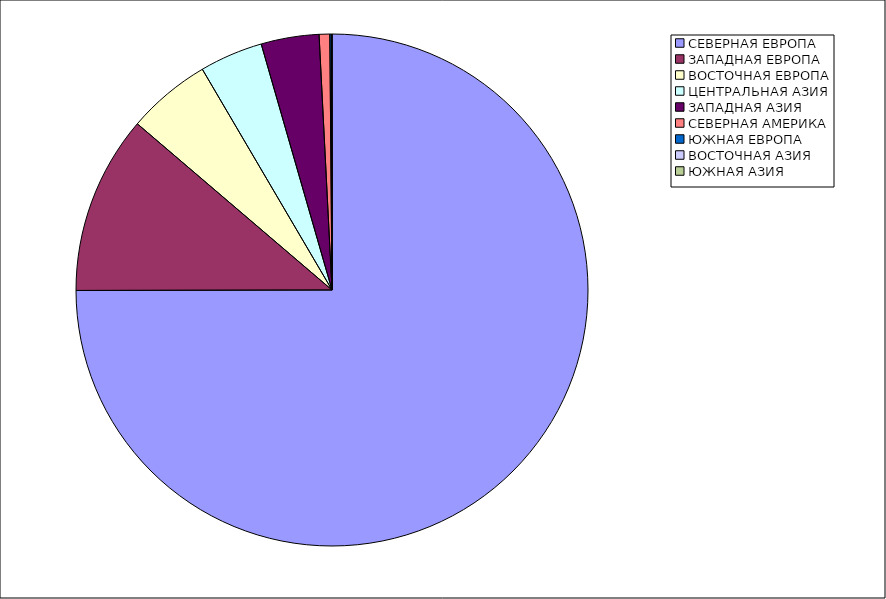
| Category | Оборот |
|---|---|
| СЕВЕРНАЯ ЕВРОПА | 74.972 |
| ЗАПАДНАЯ ЕВРОПА | 11.275 |
| ВОСТОЧНАЯ ЕВРОПА | 5.3 |
| ЦЕНТРАЛЬНАЯ АЗИЯ | 3.993 |
| ЗАПАДНАЯ АЗИЯ | 3.654 |
| СЕВЕРНАЯ АМЕРИКА | 0.67 |
| ЮЖНАЯ ЕВРОПА | 0.099 |
| ВОСТОЧНАЯ АЗИЯ | 0.036 |
| ЮЖНАЯ АЗИЯ | 0 |